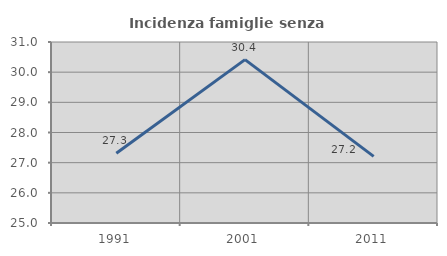
| Category | Incidenza famiglie senza nuclei |
|---|---|
| 1991.0 | 27.311 |
| 2001.0 | 30.417 |
| 2011.0 | 27.208 |